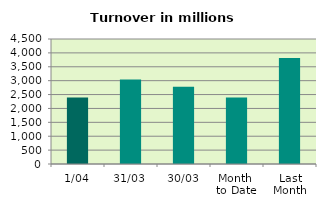
| Category | Series 0 |
|---|---|
| 1/04 | 2389.711 |
| 31/03 | 3038.312 |
| 30/03 | 2781.393 |
| Month 
to Date | 2389.711 |
| Last
Month | 3816.191 |